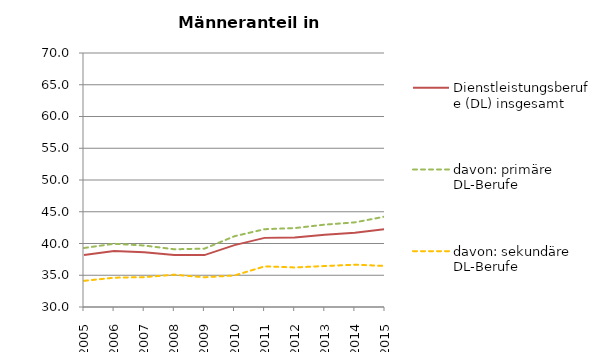
| Category | Dienstleistungsberufe (DL) insgesamt | davon: primäre DL-Berufe | davon: sekundäre DL-Berufe |
|---|---|---|---|
| 2005 | 38.171 | 39.294 | 34.123 |
| 2006 | 38.82 | 39.959 | 34.614 |
| 2007 | 38.624 | 39.681 | 34.706 |
| 2008 | 38.2 | 39.092 | 35.083 |
| 2009 | 38.17 | 39.187 | 34.683 |
| 2010 | 39.742 | 41.147 | 34.965 |
| 2011 | 40.886 | 42.252 | 36.396 |
| 2012 | 40.936 | 42.426 | 36.229 |
| 2013 | 41.376 | 42.97 | 36.453 |
| 2014 | 41.68 | 43.33 | 36.661 |
| 2015 | 42.28 | 44.242 | 36.47 |